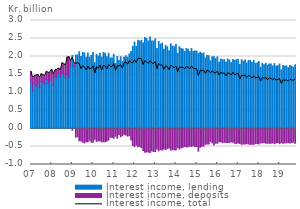
| Category | Interest income, lending | Interest income, deposits |
|---|---|---|
| 2007-01-01 | 1.29 | 0.29 |
| 2007-02-01 | 1.05 | 0.36 |
| 2007-03-01 | 1.24 | 0.21 |
| 2007-04-01 | 1.18 | 0.29 |
| 2007-05-01 | 1.26 | 0.23 |
| 2007-06-01 | 1.14 | 0.27 |
| 2007-07-01 | 1.31 | 0.2 |
| 2007-08-01 | 1.29 | 0.19 |
| 2007-09-01 | 1.23 | 0.23 |
| 2007-10-01 | 1.36 | 0.22 |
| 2007-11-01 | 1.26 | 0.28 |
| 2007-12-01 | 1.34 | 0.22 |
| 2008-01-01 | 1.41 | 0.22 |
| 2008-02-01 | 1.2 | 0.3 |
| 2008-03-01 | 1.44 | 0.18 |
| 2008-04-01 | 1.42 | 0.21 |
| 2008-05-01 | 1.53 | 0.14 |
| 2008-06-01 | 1.45 | 0.16 |
| 2008-07-01 | 1.54 | 0.27 |
| 2008-08-01 | 1.51 | 0.28 |
| 2008-09-01 | 1.41 | 0.33 |
| 2008-10-01 | 1.49 | 0.49 |
| 2008-11-01 | 1.42 | 0.56 |
| 2008-12-01 | 1.74 | 0.13 |
| 2009-01-01 | 2.03 | -0.05 |
| 2009-02-01 | 1.72 | 0.1 |
| 2009-03-01 | 2.04 | -0.24 |
| 2009-04-01 | 2.04 | -0.23 |
| 2009-05-01 | 2.13 | -0.34 |
| 2009-06-01 | 2 | -0.35 |
| 2009-07-01 | 2.11 | -0.38 |
| 2009-08-01 | 2.1 | -0.4 |
| 2009-09-01 | 1.98 | -0.37 |
| 2009-10-01 | 2.1 | -0.37 |
| 2009-11-01 | 1.98 | -0.33 |
| 2009-12-01 | 2.03 | -0.38 |
| 2010-01-01 | 2.11 | -0.38 |
| 2010-02-01 | 1.83 | -0.3 |
| 2010-03-01 | 2.06 | -0.36 |
| 2010-04-01 | 2.01 | -0.34 |
| 2010-05-01 | 2.09 | -0.35 |
| 2010-06-01 | 1.98 | -0.37 |
| 2010-07-01 | 2.11 | -0.37 |
| 2010-08-01 | 2.09 | -0.37 |
| 2010-09-01 | 1.99 | -0.35 |
| 2010-10-01 | 2.09 | -0.32 |
| 2010-11-01 | 1.96 | -0.24 |
| 2010-12-01 | 1.96 | -0.25 |
| 2011-01-01 | 2.06 | -0.27 |
| 2011-02-01 | 1.81 | -0.21 |
| 2011-03-01 | 2 | -0.27 |
| 2011-04-01 | 1.89 | -0.17 |
| 2011-05-01 | 1.99 | -0.23 |
| 2011-06-01 | 1.86 | -0.2 |
| 2011-07-01 | 1.98 | -0.16 |
| 2011-08-01 | 2.02 | -0.18 |
| 2011-09-01 | 1.98 | -0.21 |
| 2011-10-01 | 2.07 | -0.2 |
| 2011-11-01 | 2.14 | -0.32 |
| 2011-12-01 | 2.28 | -0.47 |
| 2012-01-01 | 2.4 | -0.5 |
| 2012-02-01 | 2.28 | -0.46 |
| 2012-03-01 | 2.45 | -0.51 |
| 2012-04-01 | 2.43 | -0.5 |
| 2012-05-01 | 2.45 | -0.53 |
| 2012-06-01 | 2.38 | -0.61 |
| 2012-07-01 | 2.53 | -0.66 |
| 2012-08-01 | 2.5 | -0.65 |
| 2012-09-01 | 2.43 | -0.65 |
| 2012-10-01 | 2.54 | -0.67 |
| 2012-11-01 | 2.43 | -0.62 |
| 2012-12-01 | 2.43 | -0.64 |
| 2013-01-01 | 2.49 | -0.64 |
| 2013-02-01 | 2.22 | -0.57 |
| 2013-03-01 | 2.42 | -0.62 |
| 2013-04-01 | 2.34 | -0.59 |
| 2013-05-01 | 2.37 | -0.6 |
| 2013-06-01 | 2.2 | -0.57 |
| 2013-07-01 | 2.31 | -0.58 |
| 2013-08-01 | 2.27 | -0.56 |
| 2013-09-01 | 2.16 | -0.54 |
| 2013-10-01 | 2.35 | -0.6 |
| 2013-11-01 | 2.29 | -0.59 |
| 2013-12-01 | 2.27 | -0.59 |
| 2014-01-01 | 2.33 | -0.6 |
| 2014-02-01 | 2.09 | -0.53 |
| 2014-03-01 | 2.27 | -0.57 |
| 2014-04-01 | 2.22 | -0.54 |
| 2014-05-01 | 2.21 | -0.52 |
| 2014-06-01 | 2.14 | -0.5 |
| 2014-07-01 | 2.22 | -0.51 |
| 2014-08-01 | 2.2 | -0.51 |
| 2014-09-01 | 2.14 | -0.49 |
| 2014-10-01 | 2.22 | -0.5 |
| 2014-11-01 | 2.14 | -0.48 |
| 2014-12-01 | 2.15 | -0.5 |
| 2015-01-01 | 2.15 | -0.5 |
| 2015-02-01 | 2.08 | -0.63 |
| 2015-03-01 | 2.12 | -0.52 |
| 2015-04-01 | 2.08 | -0.49 |
| 2015-05-01 | 2.1 | -0.49 |
| 2015-06-01 | 1.96 | -0.44 |
| 2015-07-01 | 2.03 | -0.43 |
| 2015-08-01 | 2.02 | -0.43 |
| 2015-09-01 | 1.88 | -0.36 |
| 2015-10-01 | 1.99 | -0.4 |
| 2015-11-01 | 1.99 | -0.46 |
| 2015-12-01 | 1.94 | -0.41 |
| 2016-01-01 | 1.99 | -0.41 |
| 2016-02-01 | 1.84 | -0.37 |
| 2016-03-01 | 1.93 | -0.37 |
| 2016-04-01 | 1.91 | -0.39 |
| 2016-05-01 | 1.91 | -0.38 |
| 2016-06-01 | 1.84 | -0.39 |
| 2016-07-01 | 1.93 | -0.39 |
| 2016-08-01 | 1.9 | -0.39 |
| 2016-09-01 | 1.83 | -0.37 |
| 2016-10-01 | 1.92 | -0.38 |
| 2016-11-01 | 1.89 | -0.41 |
| 2016-12-01 | 1.91 | -0.42 |
| 2017-01-01 | 1.92 | -0.4 |
| 2017-02-01 | 1.78 | -0.42 |
| 2017-03-01 | 1.91 | -0.44 |
| 2017-04-01 | 1.87 | -0.43 |
| 2017-05-01 | 1.9 | -0.43 |
| 2017-06-01 | 1.82 | -0.42 |
| 2017-07-01 | 1.89 | -0.43 |
| 2017-08-01 | 1.89 | -0.44 |
| 2017-09-01 | 1.83 | -0.44 |
| 2017-10-01 | 1.89 | -0.44 |
| 2017-11-01 | 1.81 | -0.42 |
| 2017-12-01 | 1.82 | -0.42 |
| 2018-01-01 | 1.86 | -0.43 |
| 2018-02-01 | 1.7 | -0.4 |
| 2018-03-01 | 1.81 | -0.4 |
| 2018-04-01 | 1.77 | -0.39 |
| 2018-05-01 | 1.81 | -0.41 |
| 2018-06-01 | 1.75 | -0.41 |
| 2018-07-01 | 1.79 | -0.41 |
| 2018-08-01 | 1.79 | -0.41 |
| 2018-09-01 | 1.74 | -0.4 |
| 2018-10-01 | 1.8 | -0.42 |
| 2018-11-01 | 1.73 | -0.4 |
| 2018-12-01 | 1.74 | -0.39 |
| 2019-01-01 | 1.79 | -0.42 |
| 2019-02-01 | 1.63 | -0.39 |
| 2019-03-01 | 1.75 | -0.41 |
| 2019-04-01 | 1.73 | -0.4 |
| 2019-05-01 | 1.74 | -0.4 |
| 2019-06-01 | 1.69 | -0.39 |
| 2019-07-01 | 1.75 | -0.4 |
| 2019-08-01 | 1.73 | -0.39 |
| 2019-09-01 | 1.7 | -0.38 |
| 2019-10-01 | 1.77 | -0.41 |